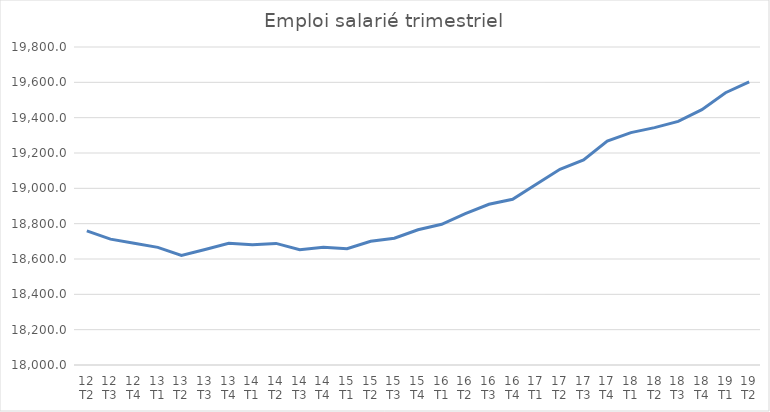
| Category | En milliers de salariés |
|---|---|
| 12 T2 | 18759.2 |
| 12 T3 | 18712.4 |
| 12 T4 | 18688.7 |
| 13 T1 | 18665.9 |
| 13 T2 | 18620 |
| 13 T3 | 18653.7 |
| 13 T4 | 18689.4 |
| 14 T1 | 18680.2 |
| 14 T2 | 18688.2 |
| 14 T3 | 18652.6 |
| 14 T4 | 18667.1 |
| 15 T1 | 18657.8 |
| 15 T2 | 18700.4 |
| 15 T3 | 18717.7 |
| 15 T4 | 18765.7 |
| 16 T1 | 18796.3 |
| 16 T2 | 18857 |
| 16 T3 | 18909.9 |
| 16 T4 | 18937.9 |
| 17 T1 | 19023.2 |
| 17 T2 | 19107.5 |
| 17 T3 | 19161 |
| 17 T4 | 19267.9 |
| 18 T1 | 19315.5 |
| 18 T2 | 19343.7 |
| 18 T3 | 19379.1 |
| 18 T4 | 19445.4 |
| 19 T1 | 19541 |
| 19 T2 | 19603.1 |